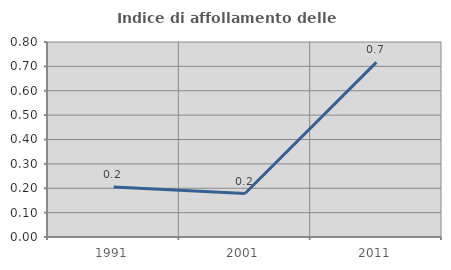
| Category | Indice di affollamento delle abitazioni  |
|---|---|
| 1991.0 | 0.205 |
| 2001.0 | 0.178 |
| 2011.0 | 0.716 |